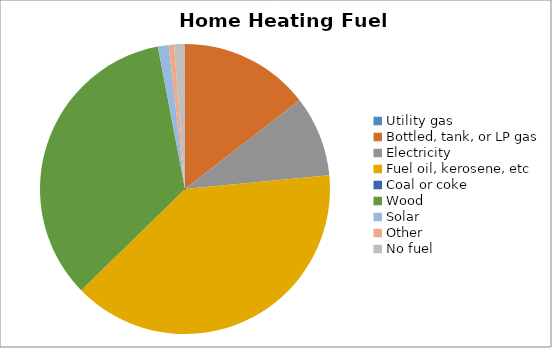
| Category | Owner |
|---|---|
| Utility gas | 0 |
| Bottled, tank, or LP gas | 0.145 |
| Electricity | 0.09 |
| Fuel oil, kerosene, etc | 0.392 |
| Coal or coke | 0 |
| Wood | 0.343 |
| Solar | 0.012 |
| Other | 0.006 |
| No fuel | 0.012 |